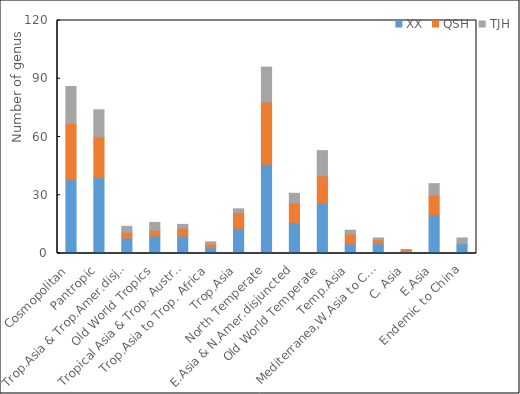
| Category | XX | QSH | TJH |
|---|---|---|---|
| Cosmopolitan | 38 | 29 | 19 |
| Pantropic | 39 | 21 | 14 |
| Trop.Asia & Trop.Amer.disjuncted | 8 | 3 | 3 |
| Old World Tropics | 9 | 3 | 4 |
| Tropical Asia & Trop. Australasis | 9 | 4 | 2 |
| Trop.Asia to Trop. Africa | 3 | 2 | 1 |
| Trop.Asia | 13 | 8 | 2 |
| North Temperate | 46 | 32 | 18 |
| E.Asia & N.Amer.disjuncted | 16 | 10 | 5 |
| Old World Temperate | 26 | 14 | 13 |
| Temp.Asia | 5 | 5 | 2 |
| Mediterranea,W.Asia to C.Asia | 5 | 2 | 1 |
| C. Asia | 1 | 1 | 0 |
| E.Asia | 20 | 10 | 6 |
| Endemic to China | 5 | 0 | 3 |